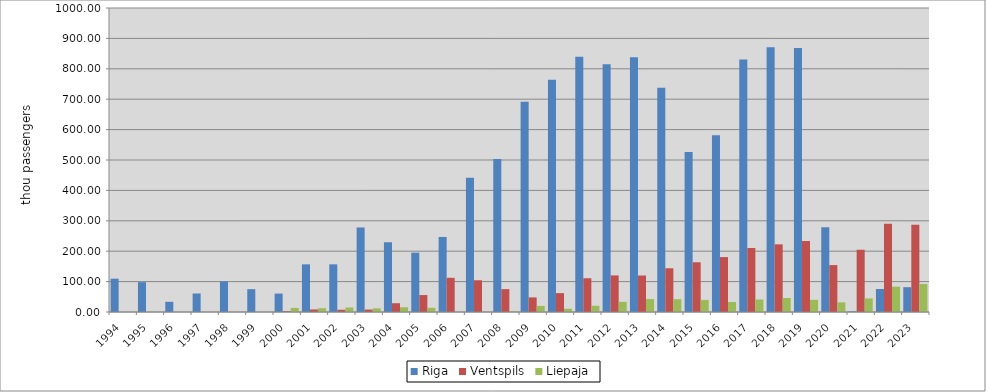
| Category | Riga | Ventspils | Liepaja |
|---|---|---|---|
| 1994.0 | 109.57 | 0 | 0 |
| 1995.0 | 98.19 | 0 | 0 |
| 1996.0 | 33.55 | 0 | 0 |
| 1997.0 | 60.88 | 0 | 0 |
| 1998.0 | 100.833 | 0 | 0 |
| 1999.0 | 75.147 | 0 | 0 |
| 2000.0 | 60.586 | 2.681 | 13.311 |
| 2001.0 | 156.77 | 8.37 | 12.356 |
| 2002.0 | 156.77 | 7.404 | 14.786 |
| 2003.0 | 278.028 | 8.032 | 12.162 |
| 2004.0 | 229.474 | 28.887 | 15.53 |
| 2005.0 | 195.195 | 55.788 | 13.812 |
| 2006.0 | 246.885 | 112.46 | 0.153 |
| 2007.0 | 441.914 | 104.422 | 0.116 |
| 2008.0 | 503.594 | 75.174 | 2.115 |
| 2009.0 | 691.236 | 48.012 | 20.041 |
| 2010.0 | 764.001 | 62.109 | 10.674 |
| 2011.0 | 839.712 | 111.019 | 20.432 |
| 2012.0 | 815.026 | 120.344 | 33.361 |
| 2013.0 | 837.665 | 120.014 | 42.607 |
| 2014.0 | 737.865 | 143.891 | 42.203 |
| 2015.0 | 526.243 | 163.666 | 39.782 |
| 2016.0 | 581.577 | 180.632 | 32.992 |
| 2017.0 | 830.38 | 210.532 | 41.111 |
| 2018.0 | 870.825 | 222.562 | 46.113 |
| 2019.0 | 868.656 | 233.537 | 39.987 |
| 2020.0 | 278.759 | 154.347 | 31.731 |
| 2021.0 | 2.005 | 204.843 | 44.612 |
| 2022.0 | 75.73 | 290.457 | 83.323 |
| 2023.0 | 81.591 | 286.967 | 92.089 |